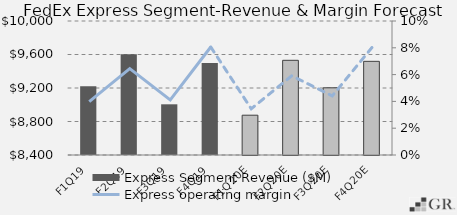
| Category | Express Segment Revenue ($M) |
|---|---|
|  F1Q19  | 9221.298 |
|  F2Q19  | 9603.601 |
|  F3Q19  | 9005.337 |
|  F4Q19  | 9499.812 |
|  F1Q20E  | 8875.373 |
|  F2Q20E  | 9530.618 |
|  F3Q20E  | 9202.318 |
|  F4Q20E  | 9518.38 |